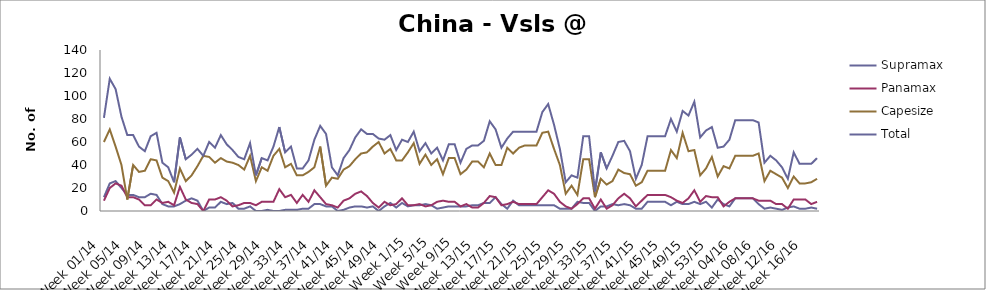
| Category | Supramax | Panamax | Capesize | Total |
|---|---|---|---|---|
| Week 01/14 | 12 | 9 | 60 | 81 |
| Week 02/14 | 24 | 20 | 71 | 115 |
| Week 03/14 | 26 | 24 | 56 | 106 |
| Week 04/14 | 20 | 22 | 40 | 82 |
| Week 05/14 | 14 | 12 | 10 | 66 |
| Week 06/14 | 14 | 12 | 40 | 66 |
| Week 07/14 | 12 | 10 | 34 | 56 |
| Week 08/14 | 12 | 5 | 35 | 52 |
| Week 09/14 | 15 | 5 | 45 | 65 |
| Week 10/14 | 14 | 10 | 44 | 68 |
| Week 11/14 | 6 | 7 | 29 | 42 |
| Week 12/14 | 4 | 8 | 26 | 38 |
| Week 13/14 | 4 | 5 | 16 | 25 |
| Week 14/14 | 6 | 21 | 37 | 64 |
| Week 15/14 | 9 | 10 | 26 | 45 |
| Week 16/14 | 11 | 7 | 31 | 49 |
| Week 17/14 | 9 | 6 | 39 | 54 |
| Week 18/14 | 0 | 0 | 48 | 48 |
| Week 19/14 | 3 | 10 | 47 | 60 |
| Week 20/14 | 3 | 10 | 42 | 55 |
| Week 21/14 | 8 | 12 | 46 | 66 |
| Week 22/14 | 6 | 9 | 43 | 58 |
| Week 23/14 | 7 | 4 | 42 | 53 |
| Week 24/14 | 2 | 5 | 40 | 47 |
| Week 25/14 | 2 | 7 | 36 | 45 |
| Week 26/14 | 4 | 7 | 48 | 59 |
| Week 27/14 | 0 | 5 | 26 | 31 |
| Week 28/14 | 0 | 8 | 38 | 46 |
| Week 29/14 | 1 | 8 | 35 | 44 |
| Week 30/14 | 0 | 8 | 48 | 56 |
| Week 31/14 | 0 | 19 | 54 | 73 |
| Week 32/14 | 1 | 12 | 38 | 51 |
| Week 33/14 | 1 | 14 | 41 | 56 |
| Week 34/14 | 1 | 7 | 31 | 37 |
| Week 35/14 | 2 | 14 | 31 | 37 |
| Week 36/14 | 2 | 8 | 34 | 44 |
| Week 37/14 | 6 | 18 | 38 | 62 |
| Week 38/14 | 6 | 12 | 56 | 74 |
| Week 39/14 | 4 | 6 | 22 | 67 |
| Week 40/14 | 4 | 5 | 29 | 38 |
| Week 41/14 | 0 | 3 | 28 | 31 |
| Week 42/14 | 1 | 9 | 36 | 46 |
| Week 43/14 | 3 | 11 | 39 | 53 |
| Week 44/14 | 4 | 15 | 45 | 64 |
| Week 45/14 | 4 | 17 | 50 | 71 |
| Week 46/14 | 3 | 13 | 51 | 67 |
| Week 47/14 | 4 | 7 | 56 | 67 |
| Week 48/14 | 0 | 3 | 60 | 63 |
| Week 49/14 | 4 | 8 | 50 | 62 |
| Week 50/14 | 7 | 5 | 54 | 66 |
| Week 51/14 | 3 | 6 | 44 | 53 |
| Week 52/14 | 7 | 11 | 44 | 62 |
| Week 1/15 | 4 | 5 | 51 | 60 |
| Week 2/15 | 5 | 5 | 59 | 69 |
| Week 3/15 | 5 | 6 | 41 | 52 |
| Week 4/15 | 6 | 4 | 49 | 59 |
| Week 5/15 | 5 | 5 | 40 | 50 |
| Week 6/15 | 2 | 8 | 45 | 55 |
| Week 7/15 | 3 | 9 | 32 | 44 |
| Week 8/15 | 4 | 8 | 46 | 58 |
| Week 9/15 | 4 | 8 | 46 | 58 |
| Week 10/15 | 4 | 4 | 32 | 42 |
| Week 11/15 | 4 | 6 | 36 | 54 |
| Week 12/15 | 5 | 3 | 43 | 57 |
| Week 13/15 | 5 | 3 | 43 | 57 |
| Week 14/15 | 7 | 7 | 38 | 61 |
| Week 15/15 | 7 | 13 | 50 | 78 |
| Week 16/15 | 12 | 12 | 40 | 71 |
| Week 17/15 | 6 | 5 | 40 | 55 |
| Week 18/15 | 2 | 6 | 55 | 63 |
| Week 19/15 | 9 | 8 | 50 | 69 |
| Week 20/15 | 5 | 6 | 55 | 69 |
| Week 21/15 | 5 | 6 | 57 | 69 |
| Week 22/15 | 5 | 6 | 57 | 69 |
| Week 23/15 | 5 | 6 | 57 | 69 |
| Week 24/15 | 5 | 12 | 68 | 86 |
| Week 25/15 | 5 | 18 | 69 | 93 |
| Week 26/15 | 5 | 15 | 54 | 75 |
| Week 27/15 | 2 | 8 | 40 | 54 |
| Week 28/15 | 2 | 4 | 15 | 25 |
| Week 29/15 | 2 | 2 | 22 | 31 |
| Week 30/15 | 8 | 6 | 14 | 29 |
| Week 31/15 | 7 | 11 | 45 | 65 |
| Week 32/15 | 7 | 11 | 45 | 65 |
| Week 33/15 | 0 | 2 | 12 | 17 |
| Week 34/15 | 4 | 10 | 28 | 51 |
| Week 35/15 | 4 | 2 | 23 | 37 |
| Week 36/15 | 6 | 5 | 26 | 48 |
| Week 37/15 | 5 | 11 | 36 | 60 |
| Week 38/15 | 6 | 15 | 33 | 61 |
| Week 39/15 | 5 | 11 | 32 | 52 |
| Week 40/15 | 2 | 4 | 22 | 28 |
| Week 41/15 | 2 | 9 | 25 | 40 |
| Week 42/15 | 8 | 14 | 35 | 65 |
| Week 43/15 | 8 | 14 | 35 | 65 |
| Week 44/15 | 8 | 14 | 35 | 65 |
| Week 45/15 | 8 | 14 | 35 | 65 |
| Week 46/15 | 5 | 12 | 53 | 80 |
| Week 47/15 | 8 | 9 | 46 | 69 |
| Week 48/15 | 6 | 7 | 68 | 87 |
| Week 49/15 | 6 | 11 | 52 | 83 |
| Week 50/15 | 8 | 18 | 53 | 95 |
| Week 51/15 | 6 | 8 | 31 | 64 |
| Week 52/15 | 8 | 13 | 37 | 70 |
| Week 53/15 | 3 | 12 | 47 | 73 |
| Week 01/16 | 10 | 12 | 30 | 55 |
| Week 02/16 | 6 | 4 | 39 | 56 |
| Week 03/16 | 4 | 8 | 37 | 62 |
| Week 04/16 | 11 | 11 | 48 | 79 |
| Week 05/16 | 11 | 11 | 48 | 79 |
| Week 06/16 | 11 | 11 | 48 | 79 |
| Week 07/16 | 11 | 11 | 48 | 79 |
| Week 08/16 | 6 | 9 | 50 | 77 |
| Week 09/16 | 2 | 9 | 26 | 42 |
| Week 10/16 | 3 | 9 | 35 | 48 |
| Week 11/16 | 2 | 6 | 32 | 44 |
| Week 12/16 | 1 | 6 | 29 | 38 |
| Week 13/16 | 3 | 2 | 20 | 28 |
| Week 14/16 | 4 | 10 | 30 | 51 |
| Week 15/16 | 2 | 10 | 24 | 41 |
| Week 16/16 | 2 | 10 | 24 | 41 |
| Week 17/16 | 3 | 6 | 25 | 41 |
| Week 18/16 | 2 | 8 | 28 | 46 |